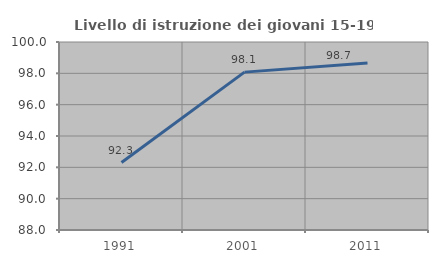
| Category | Livello di istruzione dei giovani 15-19 anni |
|---|---|
| 1991.0 | 92.308 |
| 2001.0 | 98.077 |
| 2011.0 | 98.667 |